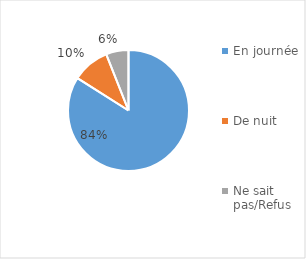
| Category | Series 0 |
|---|---|
| En journée | 0.84 |
| De nuit | 0.1 |
| Ne sait pas/Refus | 0.06 |